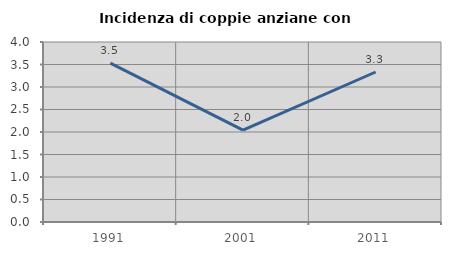
| Category | Incidenza di coppie anziane con figli |
|---|---|
| 1991.0 | 3.529 |
| 2001.0 | 2.041 |
| 2011.0 | 3.333 |